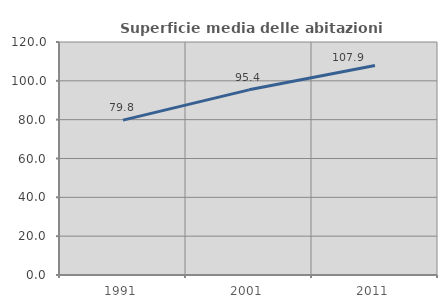
| Category | Superficie media delle abitazioni occupate |
|---|---|
| 1991.0 | 79.763 |
| 2001.0 | 95.362 |
| 2011.0 | 107.857 |